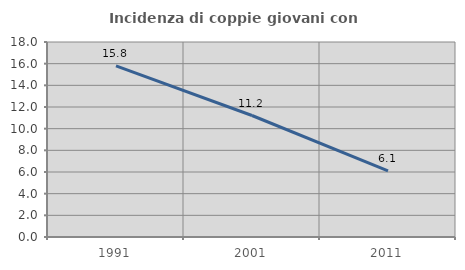
| Category | Incidenza di coppie giovani con figli |
|---|---|
| 1991.0 | 15.789 |
| 2001.0 | 11.215 |
| 2011.0 | 6.111 |